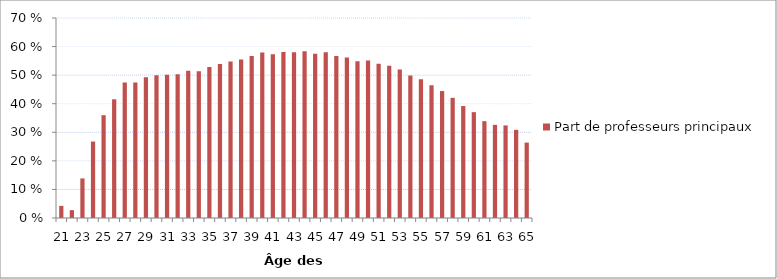
| Category | Part de professeurs principaux |
|---|---|
| 21.0 | 0.042 |
| 22.0 | 0.028 |
| 23.0 | 0.138 |
| 24.0 | 0.268 |
| 25.0 | 0.36 |
| 26.0 | 0.416 |
| 27.0 | 0.474 |
| 28.0 | 0.475 |
| 29.0 | 0.492 |
| 30.0 | 0.5 |
| 31.0 | 0.501 |
| 32.0 | 0.503 |
| 33.0 | 0.515 |
| 34.0 | 0.514 |
| 35.0 | 0.528 |
| 36.0 | 0.539 |
| 37.0 | 0.548 |
| 38.0 | 0.555 |
| 39.0 | 0.567 |
| 40.0 | 0.58 |
| 41.0 | 0.573 |
| 42.0 | 0.581 |
| 43.0 | 0.58 |
| 44.0 | 0.583 |
| 45.0 | 0.574 |
| 46.0 | 0.58 |
| 47.0 | 0.567 |
| 48.0 | 0.562 |
| 49.0 | 0.548 |
| 50.0 | 0.552 |
| 51.0 | 0.54 |
| 52.0 | 0.533 |
| 53.0 | 0.52 |
| 54.0 | 0.499 |
| 55.0 | 0.486 |
| 56.0 | 0.464 |
| 57.0 | 0.444 |
| 58.0 | 0.421 |
| 59.0 | 0.392 |
| 60.0 | 0.37 |
| 61.0 | 0.339 |
| 62.0 | 0.326 |
| 63.0 | 0.324 |
| 64.0 | 0.309 |
| 65.0 | 0.264 |